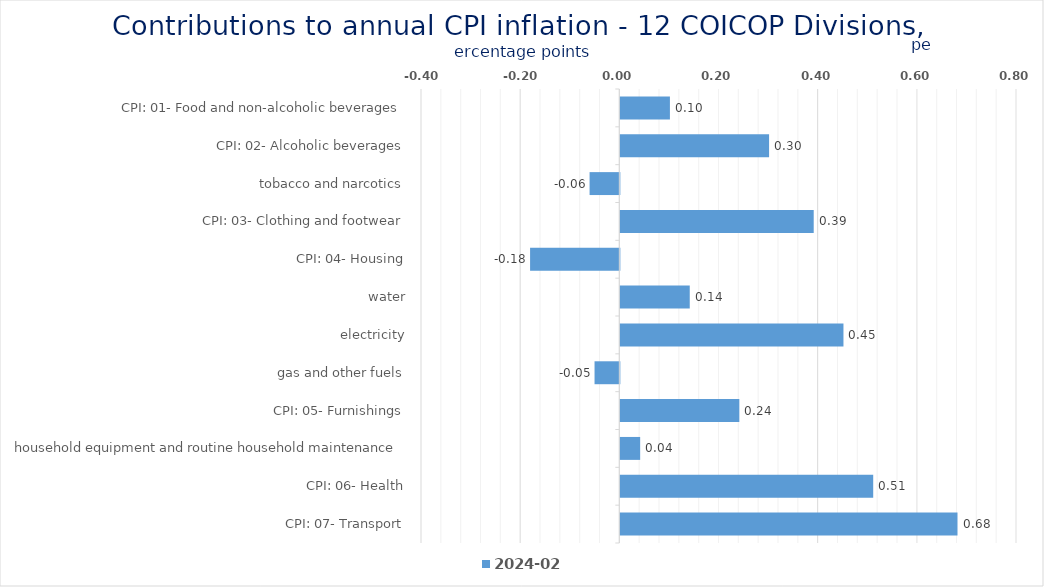
| Category | 2024-02 |
|---|---|
| CPI: 01- Food and non-alcoholic beverages | 0.1 |
| CPI: 02- Alcoholic beverages, tobacco and narcotics | 0.3 |
| CPI: 03- Clothing and footwear | -0.06 |
| CPI: 04- Housing, water, electricity, gas and other fuels | 0.39 |
| CPI: 05- Furnishings, household equipment and routine household maintenance | -0.18 |
| CPI: 06- Health | 0.14 |
| CPI: 07- Transport | 0.45 |
| CPI: 08- Communication | -0.05 |
| CPI: 09- Recreation and culture | 0.24 |
| CPI: 10- Education | 0.04 |
| CPI: 11- Restaurants and hotels | 0.51 |
| CPI: 12- Miscellaneous goods and services | 0.68 |